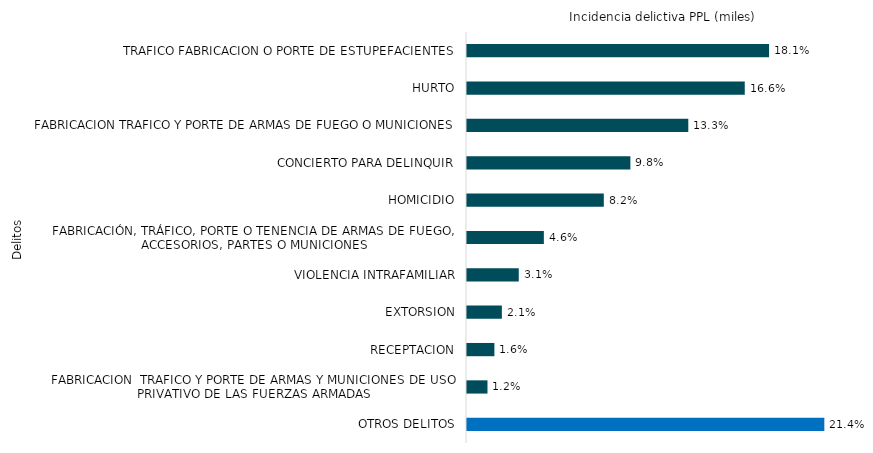
| Category | Series 0 |
|---|---|
| TRAFICO FABRICACION O PORTE DE ESTUPEFACIENTES | 15218 |
| HURTO | 13993 |
| FABRICACION TRAFICO Y PORTE DE ARMAS DE FUEGO O MUNICIONES | 11149 |
| CONCIERTO PARA DELINQUIR | 8231 |
| HOMICIDIO | 6892 |
| FABRICACIÓN, TRÁFICO, PORTE O TENENCIA DE ARMAS DE FUEGO, ACCESORIOS, PARTES O MUNICIONES | 3872 |
| VIOLENCIA INTRAFAMILIAR | 2608 |
| EXTORSION | 1756 |
| RECEPTACION | 1380 |
| FABRICACION  TRAFICO Y PORTE DE ARMAS Y MUNICIONES DE USO PRIVATIVO DE LAS FUERZAS ARMADAS | 1032 |
| OTROS DELITOS | 18002 |